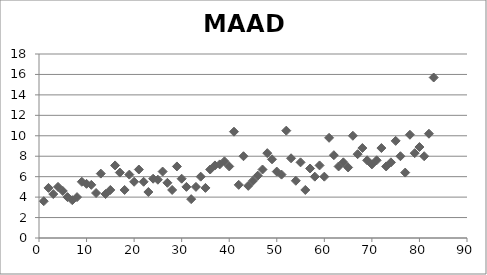
| Category | MAAD |
|---|---|
| 1.0 | 3.6 |
| 2.0 | 4.9 |
| 3.0 | 4.3 |
| 4.0 | 5 |
| 5.0 | 4.6 |
| 6.0 | 4 |
| 7.0 | 3.7 |
| 8.0 | 4 |
| 9.0 | 5.5 |
| 10.0 | 5.3 |
| 11.0 | 5.2 |
| 12.0 | 4.4 |
| 13.0 | 6.3 |
| 14.0 | 4.3 |
| 15.0 | 4.7 |
| 16.0 | 7.1 |
| 17.0 | 6.4 |
| 18.0 | 4.7 |
| 19.0 | 6.2 |
| 20.0 | 5.5 |
| 21.0 | 6.7 |
| 22.0 | 5.5 |
| 23.0 | 4.5 |
| 24.0 | 5.8 |
| 25.0 | 5.7 |
| 26.0 | 6.5 |
| 27.0 | 5.4 |
| 28.0 | 4.7 |
| 29.0 | 7 |
| 30.0 | 5.8 |
| 31.0 | 5 |
| 32.0 | 3.8 |
| 33.0 | 5 |
| 34.0 | 6 |
| 35.0 | 4.9 |
| 36.0 | 6.7 |
| 37.0 | 7.1 |
| 38.0 | 7.2 |
| 39.0 | 7.5 |
| 40.0 | 7 |
| 41.0 | 10.4 |
| 42.0 | 5.2 |
| 43.0 | 8 |
| 44.0 | 5.1 |
| 45.0 | 5.6 |
| 46.0 | 6.1 |
| 47.0 | 6.7 |
| 48.0 | 8.3 |
| 49.0 | 7.7 |
| 50.0 | 6.5 |
| 51.0 | 6.2 |
| 52.0 | 10.5 |
| 53.0 | 7.8 |
| 54.0 | 5.6 |
| 55.0 | 7.4 |
| 56.0 | 4.7 |
| 57.0 | 6.8 |
| 58.0 | 6 |
| 59.0 | 7.1 |
| 60.0 | 6 |
| 61.0 | 9.8 |
| 62.0 | 8.1 |
| 63.0 | 7 |
| 64.0 | 7.4 |
| 65.0 | 6.9 |
| 66.0 | 10 |
| 67.0 | 8.2 |
| 68.0 | 8.8 |
| 69.0 | 7.6 |
| 70.0 | 7.2 |
| 71.0 | 7.6 |
| 72.0 | 8.8 |
| 73.0 | 7 |
| 74.0 | 7.4 |
| 75.0 | 9.5 |
| 76.0 | 8 |
| 77.0 | 6.4 |
| 78.0 | 10.1 |
| 79.0 | 8.3 |
| 80.0 | 8.9 |
| 81.0 | 8 |
| 82.0 | 10.2 |
| 83.0 | 15.7 |